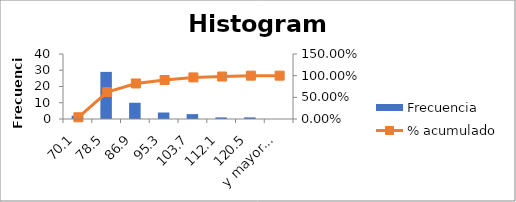
| Category | Frecuencia |
|---|---|
| 70,1 | 2 |
| 78,5 | 29 |
| 86,9 | 10 |
| 95,3 | 4 |
| 103,7 | 3 |
| 112,1 | 1 |
| 120,5 | 1 |
| y mayor... | 0 |